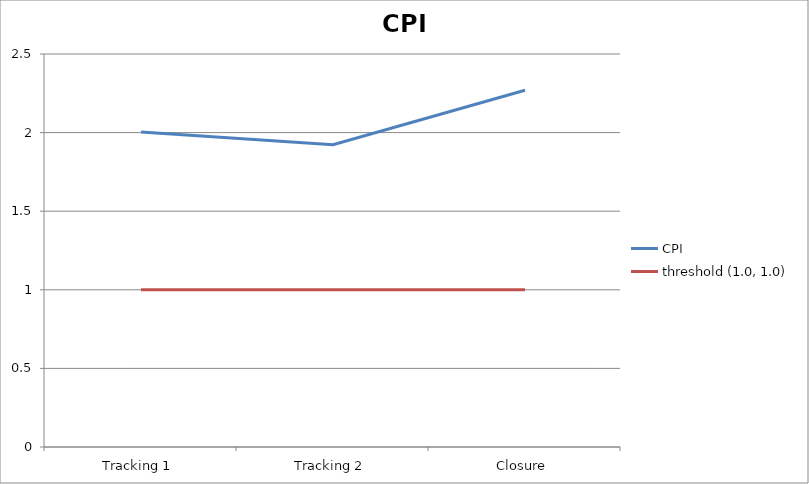
| Category | CPI | threshold (1.0, 1.0) |
|---|---|---|
| Tracking 1 | 2.004 | 1 |
| Tracking 2 | 1.922 | 1 |
| Closure | 2.27 | 1 |